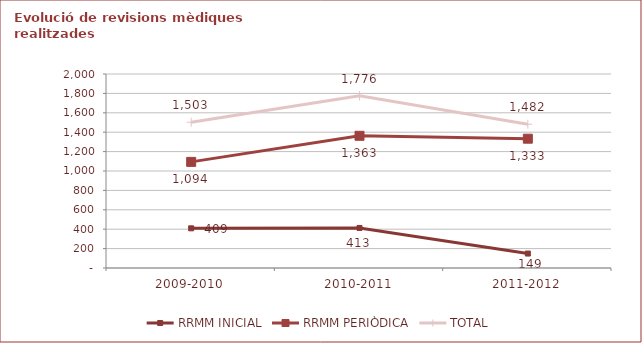
| Category | RRMM INICIAL | RRMM PERIÒDICA | TOTAL |
|---|---|---|---|
| 0 | 409 | 1094 | 1503 |
| 1 | 413 | 1363 | 1776 |
| 2 | 149 | 1333 | 1482 |